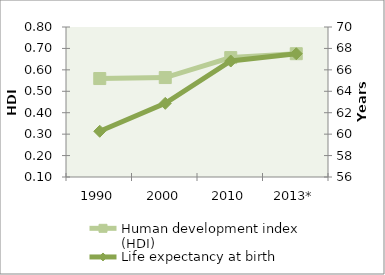
| Category | Human development index (HDI) |
|---|---|
| 1990 | 0.559 |
| 2000 | 0.564 |
| 2010 | 0.657 |
| 2013* | 0.675 |